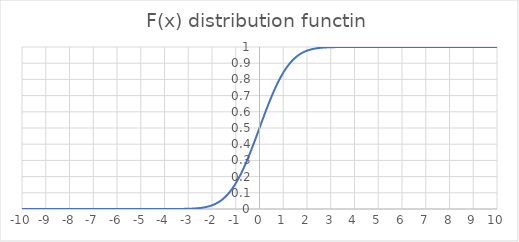
| Category | Series 0 |
|---|---|
| -10.0 | 0 |
| -9.9 | 0 |
| -9.8 | 0 |
| -9.7 | 0 |
| -9.6 | 0 |
| -9.5 | 0 |
| -9.4 | 0 |
| -9.3 | 0 |
| -9.2 | 0 |
| -9.1 | 0 |
| -9.0 | 0 |
| -8.9 | 0 |
| -8.8 | 0 |
| -8.7 | 0 |
| -8.6 | 0 |
| -8.50000000000001 | 0 |
| -8.40000000000001 | 0 |
| -8.30000000000001 | 0 |
| -8.20000000000001 | 0 |
| -8.10000000000001 | 0 |
| -8.00000000000001 | 0 |
| -7.90000000000001 | 0 |
| -7.80000000000001 | 0 |
| -7.70000000000001 | 0 |
| -7.60000000000001 | 0 |
| -7.50000000000001 | 0 |
| -7.40000000000001 | 0 |
| -7.30000000000001 | 0 |
| -7.20000000000001 | 0 |
| -7.10000000000001 | 0 |
| -7.00000000000001 | 0 |
| -6.90000000000001 | 0 |
| -6.80000000000001 | 0 |
| -6.70000000000001 | 0 |
| -6.60000000000001 | 0 |
| -6.50000000000001 | 0 |
| -6.40000000000001 | 0 |
| -6.30000000000001 | 0 |
| -6.20000000000001 | 0 |
| -6.10000000000001 | 0 |
| -6.00000000000001 | 0 |
| -5.90000000000001 | 0 |
| -5.80000000000001 | 0 |
| -5.70000000000002 | 0 |
| -5.60000000000002 | 0 |
| -5.50000000000002 | 0 |
| -5.40000000000002 | 0 |
| -5.30000000000002 | 0 |
| -5.20000000000002 | 0 |
| -5.10000000000002 | 0 |
| -5.00000000000002 | 0 |
| -4.90000000000002 | 0 |
| -4.80000000000002 | 0 |
| -4.70000000000002 | 0 |
| -4.60000000000002 | 0 |
| -4.50000000000002 | 0 |
| -4.40000000000002 | 0 |
| -4.30000000000002 | 0 |
| -4.20000000000002 | 0 |
| -4.10000000000002 | 0 |
| -4.00000000000002 | 0 |
| -3.90000000000002 | 0 |
| -3.80000000000002 | 0 |
| -3.70000000000002 | 0 |
| -3.60000000000002 | 0 |
| -3.50000000000002 | 0 |
| -3.40000000000002 | 0 |
| -3.30000000000002 | 0 |
| -3.20000000000002 | 0.001 |
| -3.10000000000002 | 0.001 |
| -3.00000000000002 | 0.001 |
| -2.90000000000003 | 0.002 |
| -2.80000000000003 | 0.003 |
| -2.70000000000003 | 0.003 |
| -2.60000000000003 | 0.005 |
| -2.50000000000003 | 0.006 |
| -2.40000000000003 | 0.008 |
| -2.30000000000003 | 0.011 |
| -2.20000000000003 | 0.014 |
| -2.10000000000003 | 0.018 |
| -2.00000000000003 | 0.023 |
| -1.90000000000003 | 0.029 |
| -1.80000000000003 | 0.036 |
| -1.70000000000003 | 0.045 |
| -1.60000000000003 | 0.055 |
| -1.50000000000003 | 0.067 |
| -1.40000000000003 | 0.081 |
| -1.30000000000003 | 0.097 |
| -1.20000000000003 | 0.115 |
| -1.10000000000003 | 0.136 |
| -1.00000000000003 | 0.159 |
| -0.900000000000031 | 0.184 |
| -0.800000000000029 | 0.212 |
| -0.700000000000029 | 0.242 |
| -0.60000000000003 | 0.274 |
| -0.50000000000003 | 0.309 |
| -0.400000000000031 | 0.345 |
| -0.300000000000029 | 0.382 |
| -0.200000000000029 | 0.421 |
| -0.100000000000041 | 0.46 |
| -4.08562073062058e-14 | 0.5 |
| 0.0999999999999996 | 0.54 |
| 0.199999999999999 | 0.579 |
| 0.300000000000001 | 0.618 |
| 0.4 | 0.655 |
| 0.5 | 0.691 |
| 0.6 | 0.726 |
| 0.699999999999999 | 0.758 |
| 0.800000000000001 | 0.788 |
| 0.9 | 0.816 |
| 1.0 | 0.841 |
| 1.1 | 0.864 |
| 1.2 | 0.885 |
| 1.3 | 0.903 |
| 1.4 | 0.919 |
| 1.5 | 0.933 |
| 1.6 | 0.945 |
| 1.7 | 0.955 |
| 1.8 | 0.964 |
| 1.9 | 0.971 |
| 2.0 | 0.977 |
| 2.1 | 0.982 |
| 2.2 | 0.986 |
| 2.3 | 0.989 |
| 2.4 | 0.992 |
| 2.5 | 0.994 |
| 2.6 | 0.995 |
| 2.7 | 0.997 |
| 2.8 | 0.997 |
| 2.9 | 0.998 |
| 3.0 | 0.999 |
| 3.1 | 0.999 |
| 3.2 | 0.999 |
| 3.3 | 1 |
| 3.4 | 1 |
| 3.5 | 1 |
| 3.6 | 1 |
| 3.7 | 1 |
| 3.8 | 1 |
| 3.9 | 1 |
| 4.0 | 1 |
| 4.0999999999999 | 1 |
| 4.1999999999999 | 1 |
| 4.2999999999999 | 1 |
| 4.3999999999999 | 1 |
| 4.4999999999999 | 1 |
| 4.5999999999999 | 1 |
| 4.6999999999999 | 1 |
| 4.7999999999999 | 1 |
| 4.8999999999999 | 1 |
| 4.9999999999999 | 1 |
| 5.0999999999999 | 1 |
| 5.1999999999999 | 1 |
| 5.2999999999999 | 1 |
| 5.3999999999999 | 1 |
| 5.4999999999999 | 1 |
| 5.5999999999999 | 1 |
| 5.6999999999999 | 1 |
| 5.7999999999999 | 1 |
| 5.8999999999999 | 1 |
| 5.9999999999999 | 1 |
| 6.0999999999999 | 1 |
| 6.1999999999999 | 1 |
| 6.2999999999999 | 1 |
| 6.3999999999999 | 1 |
| 6.4999999999999 | 1 |
| 6.5999999999999 | 1 |
| 6.6999999999999 | 1 |
| 6.7999999999999 | 1 |
| 6.8999999999999 | 1 |
| 6.9999999999999 | 1 |
| 7.0999999999999 | 1 |
| 7.1999999999999 | 1 |
| 7.2999999999999 | 1 |
| 7.3999999999999 | 1 |
| 7.4999999999999 | 1 |
| 7.5999999999999 | 1 |
| 7.6999999999999 | 1 |
| 7.7999999999999 | 1 |
| 7.8999999999999 | 1 |
| 7.9999999999999 | 1 |
| 8.0999999999999 | 1 |
| 8.1999999999999 | 1 |
| 8.2999999999999 | 1 |
| 8.3999999999999 | 1 |
| 8.4999999999999 | 1 |
| 8.5999999999999 | 1 |
| 8.6999999999999 | 1 |
| 8.7999999999999 | 1 |
| 8.8999999999999 | 1 |
| 8.9999999999999 | 1 |
| 9.0999999999999 | 1 |
| 9.1999999999999 | 1 |
| 9.2999999999999 | 1 |
| 9.3999999999999 | 1 |
| 9.4999999999999 | 1 |
| 9.5999999999999 | 1 |
| 9.6999999999999 | 1 |
| 9.7999999999999 | 1 |
| 9.8999999999999 | 1 |
| 9.9999999999999 | 1 |